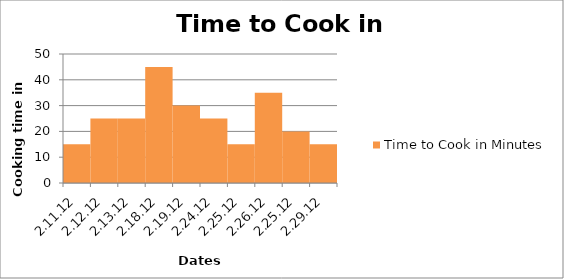
| Category | Time to Cook in Minutes |
|---|---|
| 2.11.12 | 15 |
| 2.12.12 | 25 |
| 2.13.12 | 25 |
| 2.18.12 | 45 |
| 2.19.12 | 30 |
| 2.24.12 | 25 |
| 2.25.12 | 15 |
| 2.26.12 | 35 |
| 2.25.12 | 20 |
| 2.29.12 | 15 |